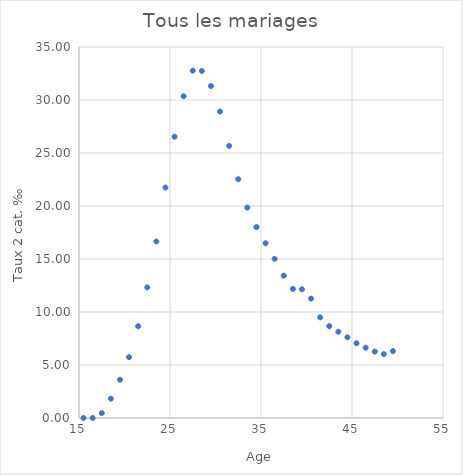
| Category | Tous les mariages |
|---|---|
| 15.5 | 0.003 |
| 16.5 | 0.008 |
| 17.5 | 0.461 |
| 18.5 | 1.826 |
| 19.5 | 3.607 |
| 20.5 | 5.746 |
| 21.5 | 8.655 |
| 22.5 | 12.321 |
| 23.5 | 16.655 |
| 24.5 | 21.742 |
| 25.5 | 26.534 |
| 26.5 | 30.352 |
| 27.5 | 32.77 |
| 28.5 | 32.74 |
| 29.5 | 31.317 |
| 30.5 | 28.912 |
| 31.5 | 25.671 |
| 32.5 | 22.531 |
| 33.5 | 19.85 |
| 34.5 | 18.011 |
| 35.5 | 16.487 |
| 36.5 | 15.015 |
| 37.5 | 13.427 |
| 38.5 | 12.178 |
| 39.5 | 12.146 |
| 40.5 | 11.259 |
| 41.5 | 9.497 |
| 42.5 | 8.668 |
| 43.5 | 8.138 |
| 44.5 | 7.612 |
| 45.5 | 7.052 |
| 46.5 | 6.626 |
| 47.5 | 6.267 |
| 48.5 | 6.027 |
| 49.5 | 6.312 |